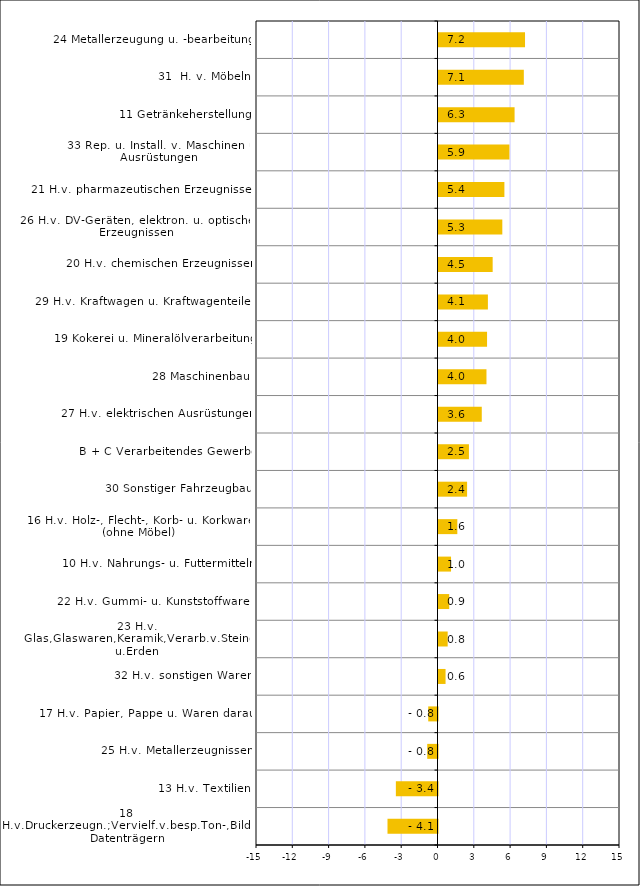
| Category | Series 0 |
|---|---|
| 18 H.v.Druckerzeugn.;Vervielf.v.besp.Ton-,Bild-u.Datenträgern | -4.132 |
| 13 H.v. Textilien | -3.441 |
| 25 H.v. Metallerzeugnissen | -0.848 |
| 17 H.v. Papier, Pappe u. Waren daraus | -0.766 |
| 32 H.v. sonstigen Waren | 0.583 |
| 23 H.v. Glas,Glaswaren,Keramik,Verarb.v.Steinen u.Erden | 0.758 |
| 22 H.v. Gummi- u. Kunststoffwaren | 0.886 |
| 10 H.v. Nahrungs- u. Futtermitteln | 1.036 |
| 16 H.v. Holz-, Flecht-, Korb- u. Korkwaren (ohne Möbel) | 1.556 |
| 30 Sonstiger Fahrzeugbau | 2.363 |
| B + C Verarbeitendes Gewerbe | 2.515 |
| 27 H.v. elektrischen Ausrüstungen | 3.576 |
| 28 Maschinenbau | 3.964 |
| 19 Kokerei u. Mineralölverarbeitung | 4.013 |
| 29 H.v. Kraftwagen u. Kraftwagenteilen | 4.082 |
| 20 H.v. chemischen Erzeugnissen | 4.476 |
| 26 H.v. DV-Geräten, elektron. u. optischen Erzeugnissen | 5.274 |
| 21 H.v. pharmazeutischen Erzeugnissen | 5.446 |
| 33 Rep. u. Install. v. Maschinen u. Ausrüstungen | 5.859 |
| 11 Getränkeherstellung | 6.288 |
| 31  H. v. Möbeln | 7.051 |
| 24 Metallerzeugung u. -bearbeitung | 7.151 |